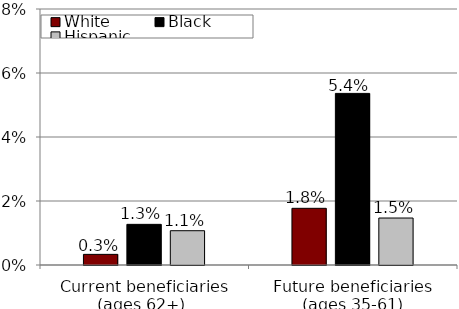
| Category | White | Black | Hispanic |
|---|---|---|---|
| Current beneficiaries
(ages 62+)  | 0.003 | 0.013 | 0.011 |
| Future beneficiaries
(ages 35-61) | 0.018 | 0.054 | 0.015 |